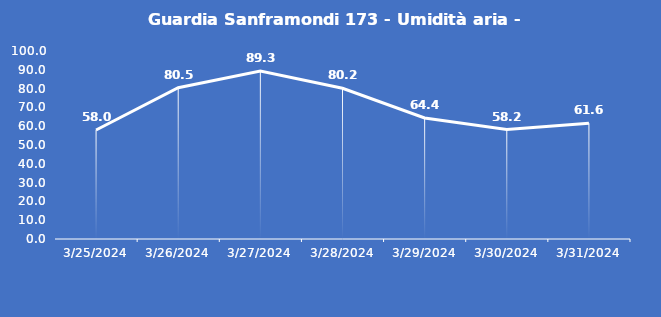
| Category | Guardia Sanframondi 173 - Umidità aria - Grezzo (%) |
|---|---|
| 3/25/24 | 58 |
| 3/26/24 | 80.5 |
| 3/27/24 | 89.3 |
| 3/28/24 | 80.2 |
| 3/29/24 | 64.4 |
| 3/30/24 | 58.2 |
| 3/31/24 | 61.6 |